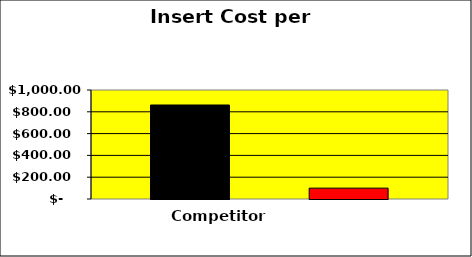
| Category | Competitor | Toshiba | Series 2 |
|---|---|---|---|
| 0 | 862.5 |  | 99.75 |